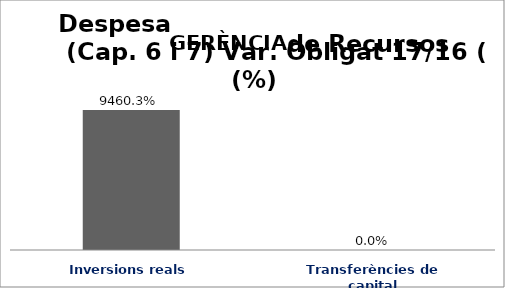
| Category | Series 0 |
|---|---|
| Inversions reals | 94.603 |
| Transferències de capital | 0 |